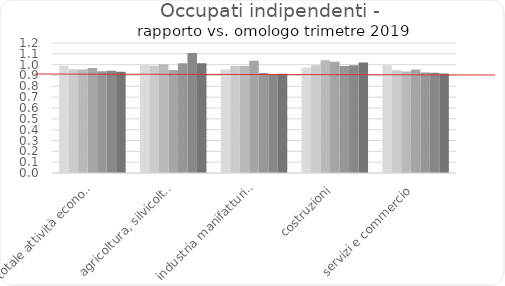
| Category | T1-2020 | T2-2020 | T3-2020 | T4-2020 | T1-2021 | T2-2021 | T3-2021 |
|---|---|---|---|---|---|---|---|
| totale attività economiche | 0.989 | 0.958 | 0.956 | 0.969 | 0.939 | 0.944 | 0.935 |
| agricoltura, silvicoltura e pesca | 0.998 | 0.989 | 1.005 | 0.95 | 1.014 | 1.107 | 1.014 |
| industria manifatturiera | 0.957 | 0.987 | 0.987 | 1.035 | 0.923 | 0.907 | 0.916 |
| costruzioni | 0.971 | 0.996 | 1.041 | 1.028 | 0.988 | 0.994 | 1.02 |
| servizi e commercio | 0.995 | 0.948 | 0.937 | 0.957 | 0.927 | 0.926 | 0.919 |